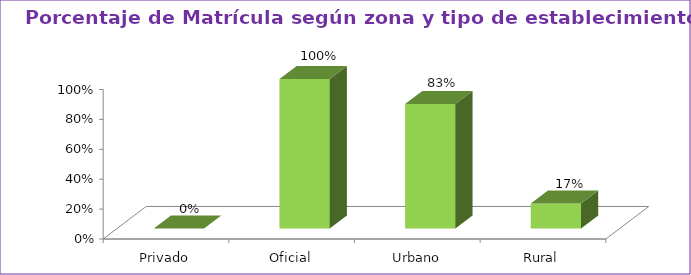
| Category | Series 1 |
|---|---|
| Privado | 0 |
| Oficial | 1 |
| Urbano | 0.833 |
| Rural | 0.167 |